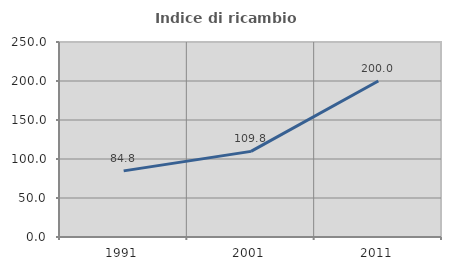
| Category | Indice di ricambio occupazionale  |
|---|---|
| 1991.0 | 84.783 |
| 2001.0 | 109.756 |
| 2011.0 | 200 |